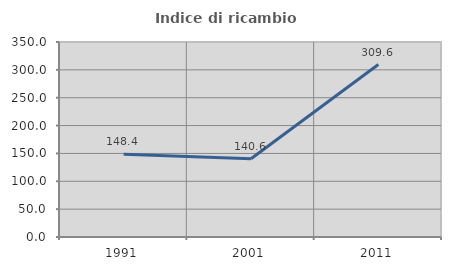
| Category | Indice di ricambio occupazionale  |
|---|---|
| 1991.0 | 148.358 |
| 2001.0 | 140.571 |
| 2011.0 | 309.615 |